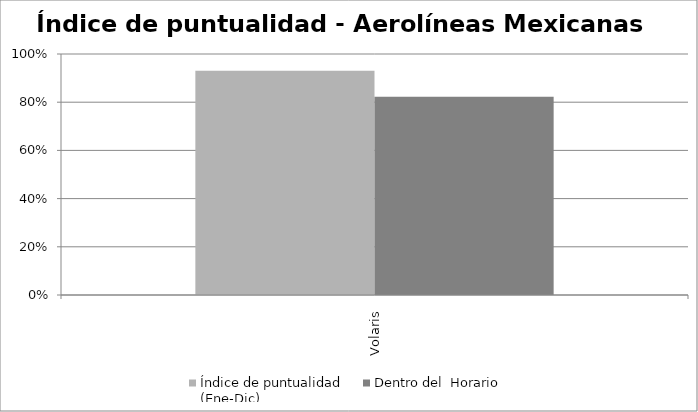
| Category | Índice de puntualidad
(Ene-Dic) | Dentro del  Horario |
|---|---|---|
| Volaris | 0.931 | 0.822 |